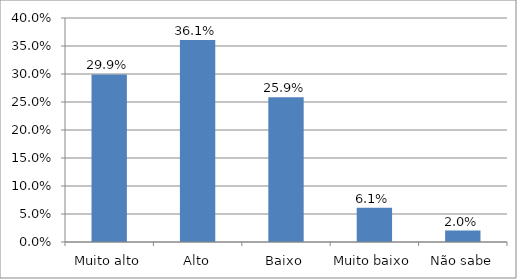
| Category | Series 0 |
|---|---|
| Muito alto | 0.299 |
| Alto | 0.361 |
| Baixo | 0.259 |
| Muito baixo | 0.061 |
| Não sabe | 0.02 |